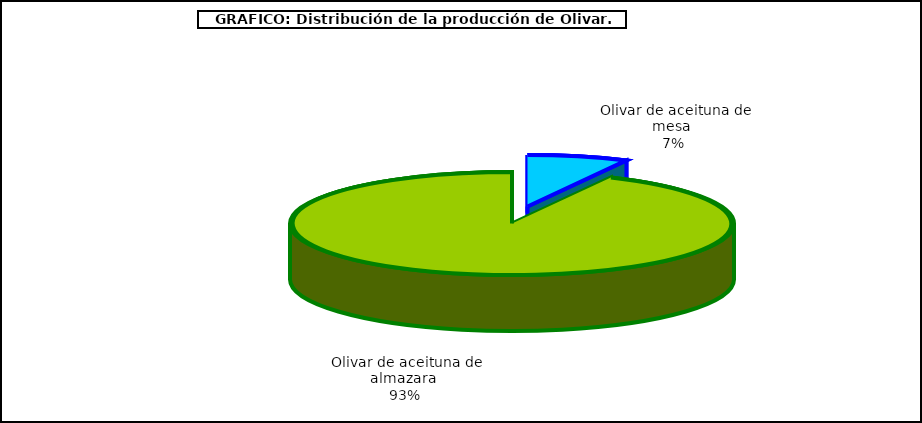
| Category | Series 0 |
|---|---|
| Olivar de aceituna de mesa | 540484 |
| Olivar de aceituna de almazara | 6811611 |